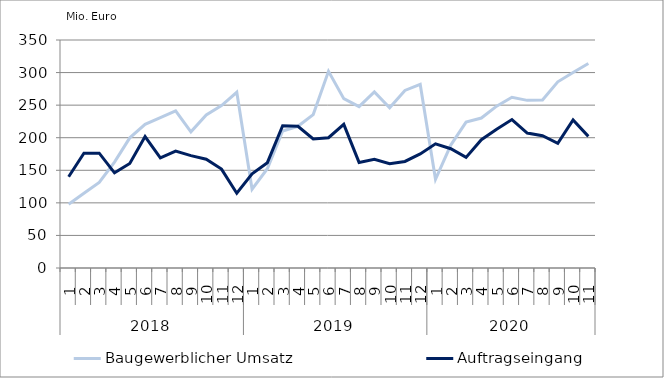
| Category | Baugewerblicher Umsatz | Auftragseingang |
|---|---|---|
| 0 | 97959.056 | 140119.385 |
| 1 | 114756.787 | 176330.213 |
| 2 | 131454.642 | 176241.061 |
| 3 | 162648.053 | 146063.407 |
| 4 | 199809.407 | 160551.931 |
| 5 | 220535.974 | 201835.846 |
| 6 | 230672.472 | 169132.23 |
| 7 | 241233.619 | 179396.293 |
| 8 | 209099.292 | 172542.764 |
| 9 | 234953.007 | 166991.729 |
| 10 | 249410.043 | 151835.629 |
| 11 | 269773.227 | 114807.456 |
| 12 | 120975.133 | 144510.881 |
| 13 | 152329.786 | 161685.201 |
| 14 | 210227.67 | 218455.879 |
| 15 | 217522.321 | 217610.064 |
| 16 | 235490.429 | 198110.439 |
| 17 | 301963.302 | 200012.086 |
| 18 | 259975.317 | 220559.061 |
| 19 | 247779.658 | 162059.723 |
| 20 | 270249.609 | 166829.611 |
| 21 | 245966.91 | 160120.773 |
| 22 | 272620.351 | 163589.389 |
| 23 | 281810.121 | 175051.247 |
| 24 | 136135.432 | 190647.086 |
| 25 | 188682.361 | 183141.14 |
| 26 | 224009.315 | 169770.009 |
| 27 | 230172.252 | 196979.845 |
| 28 | 248410.714 | 212955.83 |
| 29 | 262078.128 | 227853.487 |
| 30 | 257360.37 | 207209.188 |
| 31 | 257932.168 | 202976.091 |
| 32 | 285866.269 | 191463.844 |
| 33 | 300164.57 | 227245.467 |
| 34 | 313922.518 | 202060.636 |